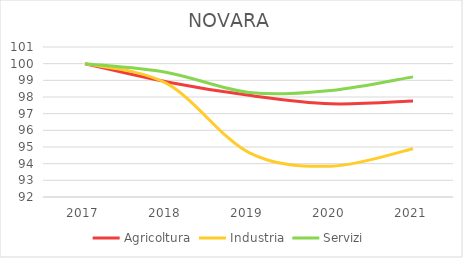
| Category | Agricoltura | Industria | Servizi |
|---|---|---|---|
| 2017.0 | 100 | 100 | 100 |
| 2018.0 | 98.902 | 98.8 | 99.474 |
| 2019.0 | 98.1 | 94.665 | 98.275 |
| 2020.0 | 97.593 | 93.848 | 98.387 |
| 2021.0 | 97.762 | 94.897 | 99.207 |